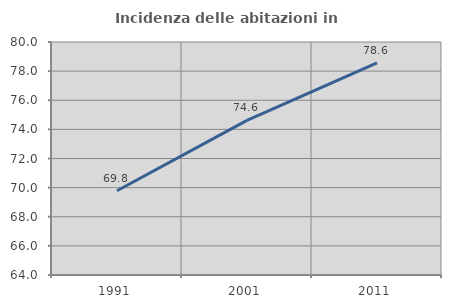
| Category | Incidenza delle abitazioni in proprietà  |
|---|---|
| 1991.0 | 69.788 |
| 2001.0 | 74.623 |
| 2011.0 | 78.571 |